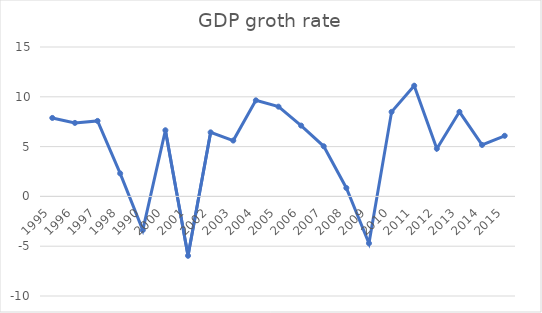
| Category | GDP groth |
|---|---|
| 1995.0 | 7.878 |
| 1996.0 | 7.38 |
| 1997.0 | 7.578 |
| 1998.0 | 2.308 |
| 1990.0 | -3.389 |
| 2000.0 | 6.64 |
| 2001.0 | -5.962 |
| 2002.0 | 6.43 |
| 2003.0 | 5.608 |
| 2004.0 | 9.644 |
| 2005.0 | 9.01 |
| 2006.0 | 7.11 |
| 2007.0 | 5.03 |
| 2008.0 | 0.845 |
| 2009.0 | -4.704 |
| 2010.0 | 8.487 |
| 2011.0 | 11.113 |
| 2012.0 | 4.79 |
| 2013.0 | 8.491 |
| 2014.0 | 5.167 |
| 2015.0 | 6.086 |